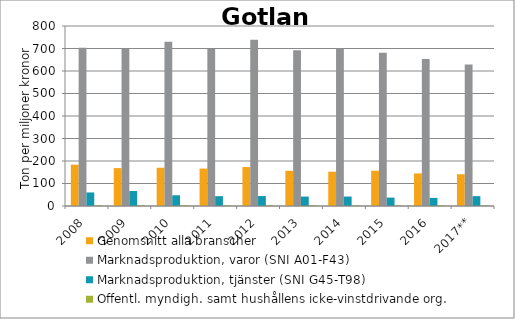
| Category | Genomsnitt alla branscher | Marknadsproduktion, varor (SNI A01-F43) | Marknadsproduktion, tjänster (SNI G45-T98) | Offentl. myndigh. samt hushållens icke-vinstdrivande org. |
|---|---|---|---|---|
| 2008 | 183.625 | 703.531 | 60.258 | 3.233 |
| 2009 | 168.427 | 698.384 | 66.559 | 3.806 |
| 2010 | 169.971 | 729.873 | 47.649 | 3.543 |
| 2011 | 166.247 | 698.085 | 43.625 | 3.286 |
| 2012 | 173.107 | 739.075 | 44.226 | 3.115 |
| 2013 | 156.543 | 692.585 | 41.969 | 2.843 |
| 2014 | 152.475 | 700.13 | 41.979 | 2.768 |
| 2015 | 156.786 | 681.094 | 37.397 | 2.892 |
| 2016 | 144.832 | 653.017 | 36.068 | 2.936 |
| 2017** | 141.278 | 628.853 | 43.788 | 2.586 |